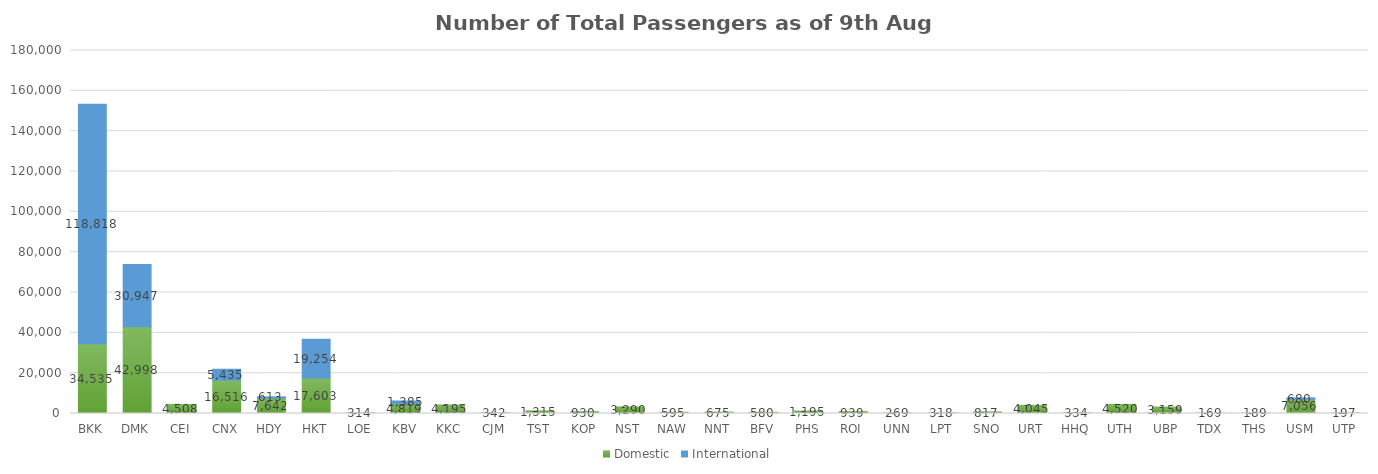
| Category | Domestic | International |
|---|---|---|
| BKK | 34535 | 118818 |
| DMK | 42998 | 30947 |
| CEI | 4508 | 0 |
| CNX | 16516 | 5435 |
| HDY | 7642 | 613 |
| HKT | 17603 | 19254 |
| LOE | 314 | 0 |
| KBV | 4819 | 1385 |
| KKC | 4195 | 0 |
| CJM | 342 | 0 |
| TST | 1315 | 0 |
| KOP | 930 | 0 |
| NST | 3290 | 0 |
| NAW | 595 | 0 |
| NNT | 675 | 0 |
| BFV | 580 | 0 |
| PHS | 1195 | 0 |
| ROI | 939 | 0 |
| UNN | 269 | 0 |
| LPT | 318 | 0 |
| SNO | 817 | 0 |
| URT | 4045 | 0 |
| HHQ | 334 | 0 |
| UTH | 4520 | 0 |
| UBP | 3159 | 0 |
| TDX | 169 | 0 |
| THS | 189 | 0 |
| USM | 7056 | 680 |
| UTP | 197 | 0 |